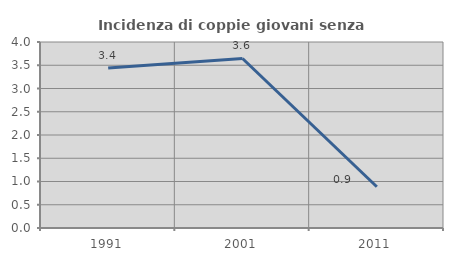
| Category | Incidenza di coppie giovani senza figli |
|---|---|
| 1991.0 | 3.44 |
| 2001.0 | 3.646 |
| 2011.0 | 0.888 |